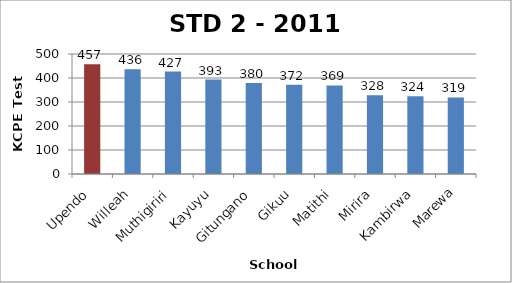
| Category | STD 2 Total Score |
|---|---|
| Upendo | 456.91 |
| Willeah | 436.36 |
| Muthigiriri | 426.76 |
| Kayuyu | 393.43 |
| Gitungano | 379.57 |
| Gikuu | 372.38 |
| Matithi | 369.26 |
| Mirira | 328.18 |
| Kambirwa | 323.78 |
| Marewa | 319.07 |